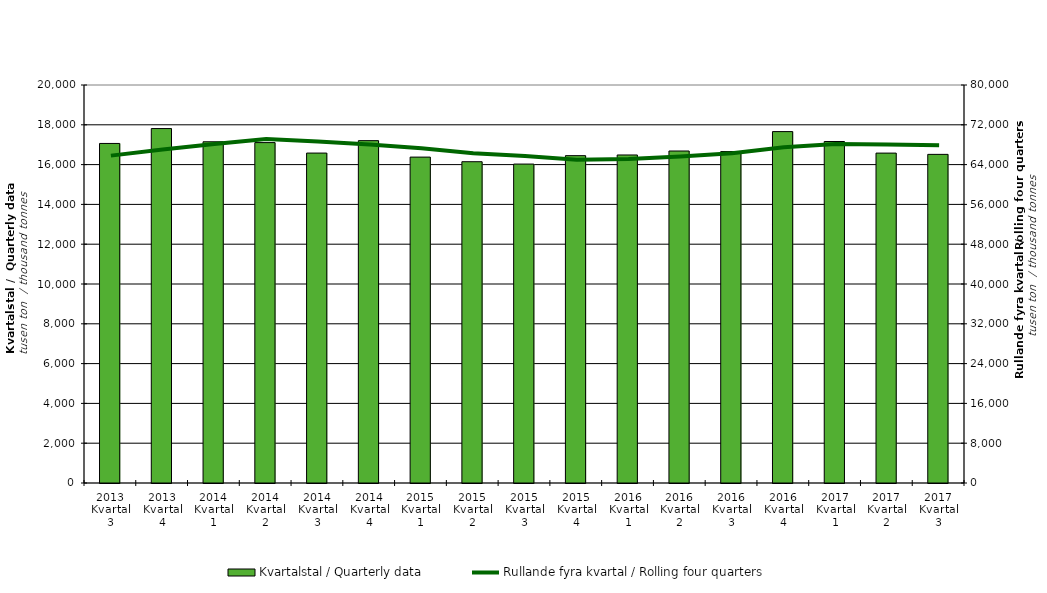
| Category | Kvartalstal / Quarterly data |
|---|---|
| 2013 Kvartal 3 | 17062.958 |
| 2013 Kvartal 4 | 17811.357 |
| 2014 Kvartal 1 | 17146.805 |
| 2014 Kvartal 2 | 17105.179 |
| 2014 Kvartal 3 | 16579.663 |
| 2014 Kvartal 4 | 17203.242 |
| 2015 Kvartal 1 | 16376.707 |
| 2015 Kvartal 2 | 16145.019 |
| 2015 Kvartal 3 | 16026.933 |
| 2015 Kvartal 4 | 16449.975 |
| 2016 Kvartal 1 | 16483.647 |
| 2016 Kvartal 2 | 16682.729 |
| 2016 Kvartal 3 | 16654.381 |
| 2016 Kvartal 4 | 17657.952 |
| 2017 Kvartal 1 | 17160.767 |
| 2017 Kvartal 2 | 16578.13 |
| 2017 Kvartal 3 | 16514.47 |